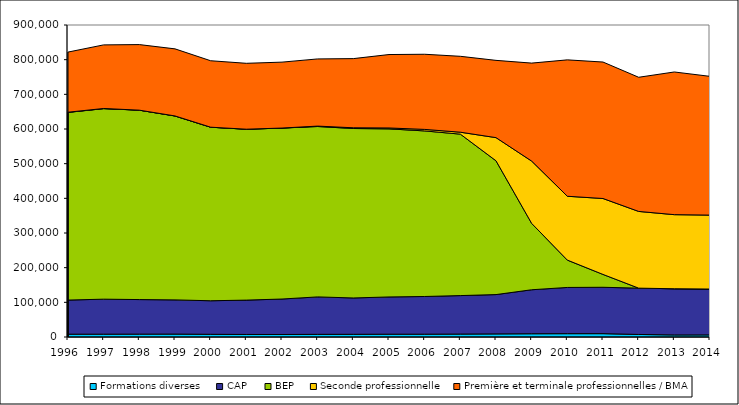
| Category | Formations diverses  | CAP  | BEP | Seconde professionnelle | Première et terminale professionnelles / BMA |
|---|---|---|---|---|---|
| 1996.0 | 8076 | 98453 | 541409 | 511 | 173404 |
| 1997.0 | 8144 | 101007 | 549551 | 510 | 183451 |
| 1998.0 | 8269 | 99696 | 546358 | 8 | 189159 |
| 1999.0 | 8393 | 98696 | 530575 | 10 | 193466 |
| 2000.0 | 7758 | 96805 | 500639 | 10 | 191670 |
| 2001.0 | 7333 | 99070 | 492975 | 38 | 190077 |
| 2002.0 | 7234 | 102334 | 493139 | 0 | 190182 |
| 2003.0 | 7668 | 107988 | 491519 | 1200 | 193732 |
| 2004.0 | 7796 | 104816 | 488828 | 2048 | 199517 |
| 2005.0 | 8072 | 107468 | 484847 | 2631 | 211772 |
| 2006.0 | 8071 | 108796 | 477633 | 4343 | 216751 |
| 2007.0 | 8432 | 111017 | 465741 | 5577 | 218938 |
| 2008.0 | 8917 | 113440 | 385962 | 66796 | 222850 |
| 2009.0 | 9346 | 126920 | 191378 | 179817 | 282621 |
| 2010.0 | 9592 | 133362 | 78847 | 184186 | 393429 |
| 2011.0 | 9631 | 133827 | 37044 | 218973 | 393697 |
| 2012.0 | 7345 | 133577 | 0 | 221278 | 387009 |
| 2013.0 | 5862 | 133277 | 0 | 213747 | 411622 |
| 2014.0 | 6021 | 132337 | 0 | 213253 | 400237 |